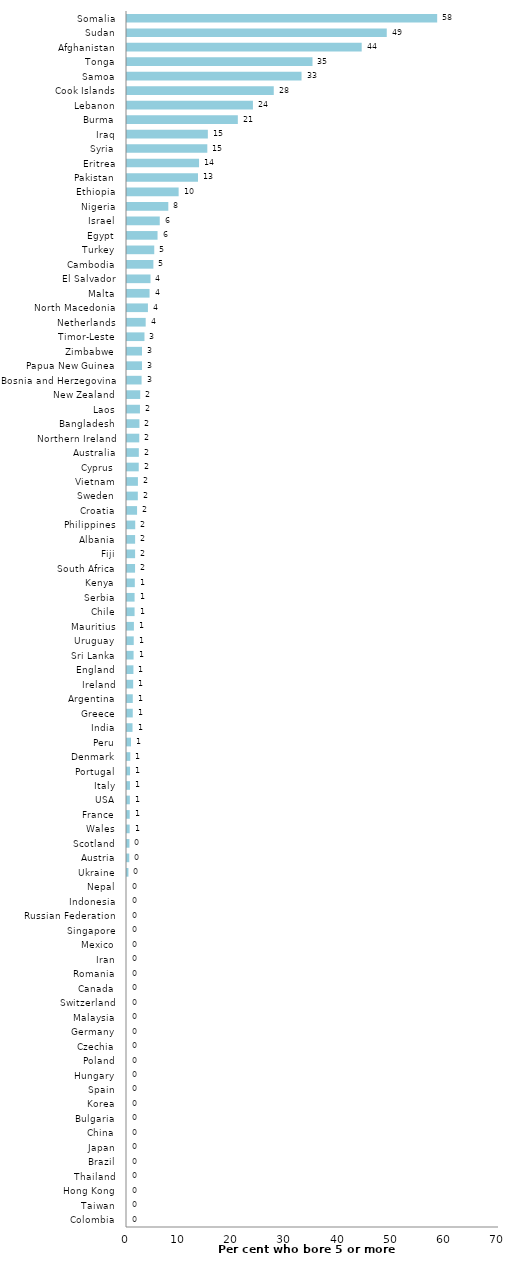
| Category | Series 0 |
|---|---|
| Colombia | 0 |
| Taiwan | 0 |
| Hong Kong | 0 |
| Thailand | 0 |
| Brazil | 0 |
| Japan | 0 |
| China | 0 |
| Bulgaria | 0 |
| Korea | 0 |
| Spain | 0 |
| Hungary | 0 |
| Poland | 0 |
| Czechia | 0 |
| Germany | 0 |
| Malaysia | 0 |
| Switzerland | 0 |
| Canada | 0 |
| Romania | 0 |
| Iran | 0 |
| Mexico | 0 |
| Singapore | 0 |
| Russian Federation | 0 |
| Indonesia | 0 |
| Nepal | 0 |
| Ukraine | 0.271 |
| Austria | 0.427 |
| Scotland | 0.46 |
| Wales | 0.501 |
| France | 0.512 |
| USA | 0.536 |
| Italy | 0.557 |
| Portugal | 0.571 |
| Denmark | 0.615 |
| Peru | 0.756 |
| India | 1.038 |
| Greece | 1.084 |
| Argentina | 1.087 |
| Ireland | 1.163 |
| England | 1.208 |
| Sri Lanka | 1.238 |
| Uruguay | 1.27 |
| Mauritius | 1.301 |
| Chile | 1.426 |
| Serbia | 1.429 |
| Kenya | 1.471 |
| South Africa | 1.515 |
| Fiji | 1.524 |
| Albania | 1.526 |
| Philippines | 1.548 |
| Croatia | 1.894 |
| Sweden | 2.036 |
| Vietnam | 2.055 |
| Cyprus | 2.209 |
| Australia | 2.226 |
| Northern Ireland | 2.308 |
| Bangladesh | 2.336 |
| Laos | 2.438 |
| New Zealand | 2.482 |
| Bosnia and Herzegovina | 2.744 |
| Papua New Guinea | 2.817 |
| Zimbabwe | 2.825 |
| Timor-Leste | 3.289 |
| Netherlands | 3.516 |
| North Macedonia | 3.937 |
| Malta | 4.242 |
| El Salvador | 4.422 |
| Cambodia | 4.965 |
| Turkey | 5.128 |
| Egypt | 5.747 |
| Israel | 6.162 |
| Nigeria | 7.772 |
| Ethiopia | 9.715 |
| Pakistan | 13.358 |
| Eritrea | 13.559 |
| Syria | 15.111 |
| Iraq | 15.214 |
| Burma | 20.856 |
| Lebanon | 23.696 |
| Cook Islands | 27.619 |
| Samoa | 32.843 |
| Tonga | 34.906 |
| Afghanistan | 44.162 |
| Sudan | 48.881 |
| Somalia | 58.366 |